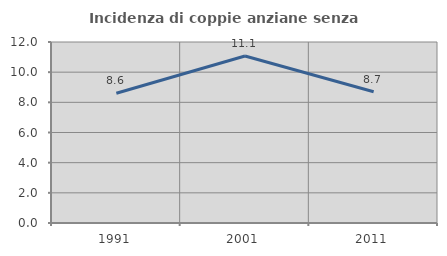
| Category | Incidenza di coppie anziane senza figli  |
|---|---|
| 1991.0 | 8.6 |
| 2001.0 | 11.069 |
| 2011.0 | 8.703 |